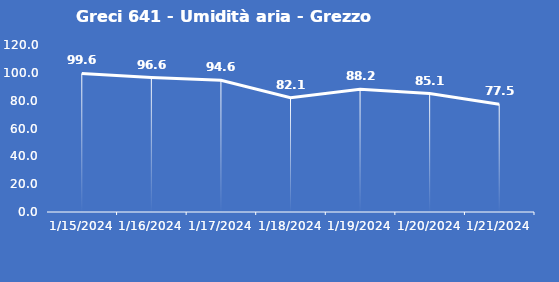
| Category | Greci 641 - Umidità aria - Grezzo (%) |
|---|---|
| 1/15/24 | 99.6 |
| 1/16/24 | 96.6 |
| 1/17/24 | 94.6 |
| 1/18/24 | 82.1 |
| 1/19/24 | 88.2 |
| 1/20/24 | 85.1 |
| 1/21/24 | 77.5 |